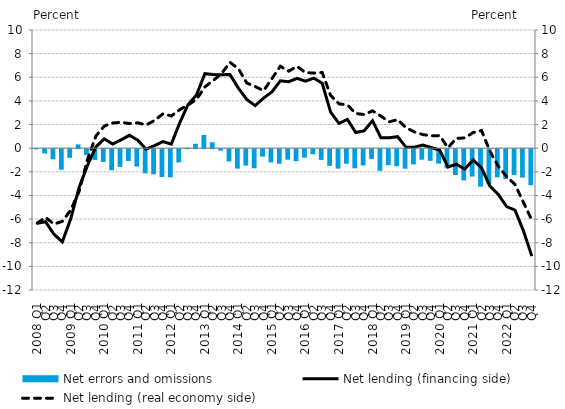
| Category | Net errors and omissions |
|---|---|
| 2008 Q1 | -0.014 |
| Q2 | -0.362 |
| Q3 | -0.855 |
| Q4 | -1.735 |
| 2009 Q1 | -0.73 |
| Q2 | 0.32 |
| Q3 | -0.501 |
| Q4 | -0.908 |
| 2010 Q1 | -1.082 |
| Q2 | -1.786 |
| Q3 | -1.488 |
| Q4 | -0.996 |
| 2011 Q1 | -1.468 |
| Q2 | -2.046 |
| Q3 | -2.125 |
| Q4 | -2.352 |
| 2012 Q1 | -2.38 |
| Q2 | -1.116 |
| Q3 | 0.036 |
| Q4 | 0.374 |
| 2013 Q1 | 1.122 |
| Q2 | 0.502 |
| Q3 | -0.116 |
| Q4 | -1.039 |
| 2014 Q1 | -1.646 |
| Q2 | -1.389 |
| Q3 | -1.616 |
| Q4 | -0.631 |
| 2015 Q1 | -1.119 |
| Q2 | -1.233 |
| Q3 | -0.888 |
| Q4 | -1.02 |
| 2016 Q1 | -0.716 |
| Q2 | -0.428 |
| Q3 | -0.909 |
| Q4 | -1.41 |
| 2017 Q1 | -1.647 |
| Q2 | -1.229 |
| Q3 | -1.614 |
| Q4 | -1.375 |
| 2018 Q1 | -0.828 |
| Q2 | -1.831 |
| Q3 | -1.356 |
| Q4 | -1.442 |
| 2019 Q1 | -1.654 |
| Q2 | -1.287 |
| Q3 | -0.887 |
| Q4 | -0.988 |
| 2020 Q1 | -1.223 |
| Q2 | -1.625 |
| Q3 | -2.185 |
| Q4 | -2.645 |
| 2021 Q1 | -2.319 |
| Q2 | -3.175 |
| Q3 | -2.958 |
| Q4 | -2.385 |
| 2022 Q1 | -2.532 |
| Q2 | -2.182 |
| Q3 | -2.407 |
| Q4 | -3.052 |